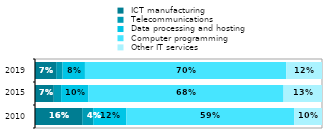
| Category |  ICT manufacturing |  Telecommunications |  Data processing and hosting |  Computer programming |  Other IT services  |
|---|---|---|---|---|---|
| 2010.0 | 0.164 | 0.038 | 0.115 | 0.585 | 0.096 |
| 2015.0 | 0.065 | 0.026 | 0.095 | 0.68 | 0.134 |
| 2019.0 | 0.074 | 0.022 | 0.078 | 0.701 | 0.125 |